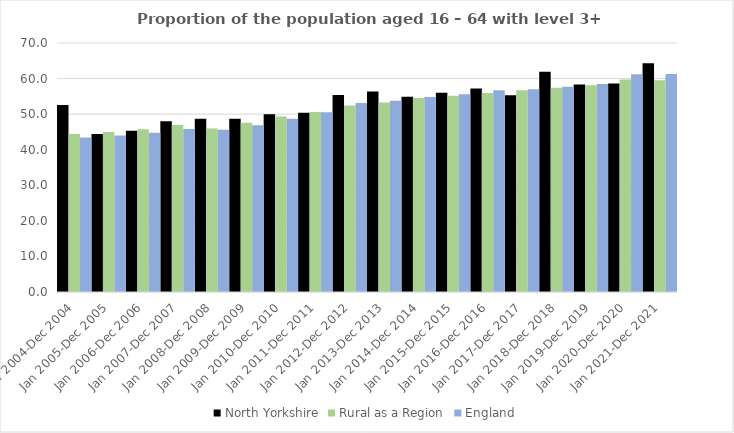
| Category | North Yorkshire | Rural as a Region | England |
|---|---|---|---|
| Jan 2004-Dec 2004 | 52.6 | 44.405 | 43.4 |
| Jan 2005-Dec 2005 | 44.4 | 44.973 | 44 |
| Jan 2006-Dec 2006 | 45.3 | 45.774 | 44.8 |
| Jan 2007-Dec 2007 | 48 | 46.968 | 45.8 |
| Jan 2008-Dec 2008 | 48.7 | 45.964 | 45.6 |
| Jan 2009-Dec 2009 | 48.7 | 47.59 | 46.9 |
| Jan 2010-Dec 2010 | 50 | 49.362 | 48.7 |
| Jan 2011-Dec 2011 | 50.4 | 50.602 | 50.5 |
| Jan 2012-Dec 2012 | 55.4 | 52.439 | 53.1 |
| Jan 2013-Dec 2013 | 56.4 | 53.276 | 53.8 |
| Jan 2014-Dec 2014 | 54.9 | 54.57 | 54.8 |
| Jan 2015-Dec 2015 | 56 | 55.16 | 55.6 |
| Jan 2016-Dec 2016 | 57.2 | 55.941 | 56.7 |
| Jan 2017-Dec 2017 | 55.3 | 56.689 | 57 |
| Jan 2018-Dec 2018 | 61.9 | 57.389 | 57.7 |
| Jan 2019-Dec 2019 | 58.3 | 58.147 | 58.5 |
| Jan 2020-Dec 2020 | 58.6 | 59.771 | 61.2 |
| Jan 2021-Dec 2021 | 64.3 | 59.54 | 61.3 |